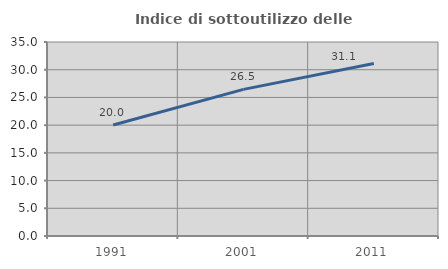
| Category | Indice di sottoutilizzo delle abitazioni  |
|---|---|
| 1991.0 | 20.033 |
| 2001.0 | 26.457 |
| 2011.0 | 31.112 |